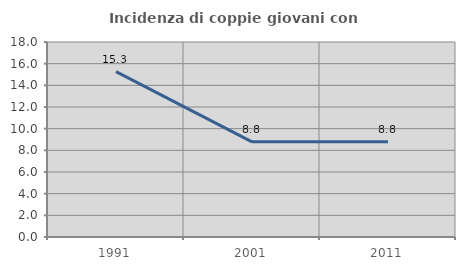
| Category | Incidenza di coppie giovani con figli |
|---|---|
| 1991.0 | 15.265 |
| 2001.0 | 8.782 |
| 2011.0 | 8.791 |